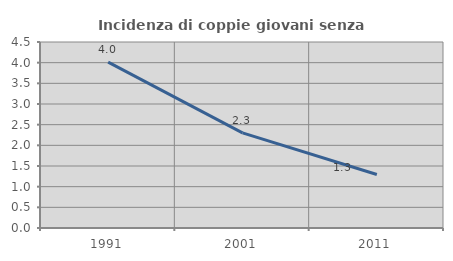
| Category | Incidenza di coppie giovani senza figli |
|---|---|
| 1991.0 | 4.011 |
| 2001.0 | 2.303 |
| 2011.0 | 1.293 |